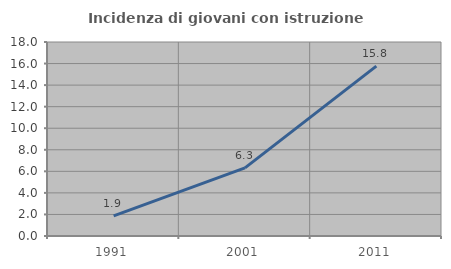
| Category | Incidenza di giovani con istruzione universitaria |
|---|---|
| 1991.0 | 1.863 |
| 2001.0 | 6.316 |
| 2011.0 | 15.758 |